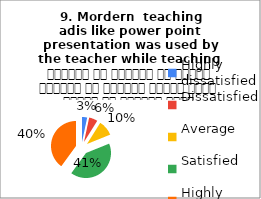
| Category |  9. Mordern  teaching 
adis like power point presentation was used by the teacher while teaching  शिक्षक ने शिक्षण के दौरान शिक्षण की आधुनिक तकनीक पावर पॉइंट का प्रयोग किया |
|---|---|
| Highly dissatisfied | 3 |
| Dissatisfied | 5 |
| Average | 9 |
| Satisfied | 37 |
| Highly satisfied | 36 |